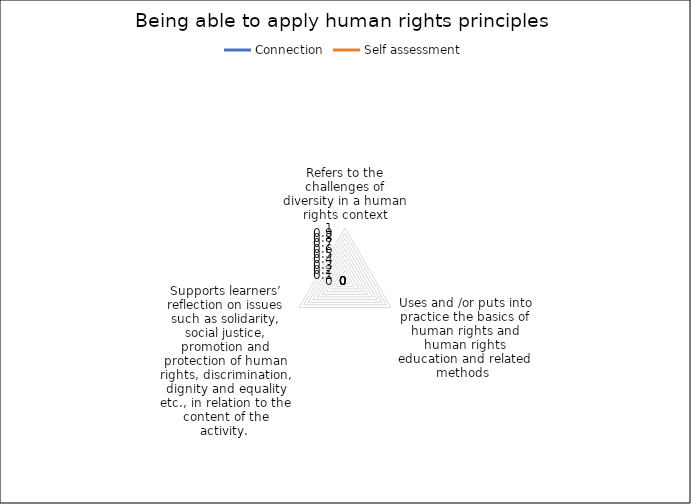
| Category | Connection | Self assessment |
|---|---|---|
| Refers to the challenges of diversity in a human rights context | 0 | 0 |
| Uses and /or puts into practice the basics of human rights and human rights education and related methods  | 0 | 0 |
| Supports learners’ reflection on issues such as solidarity, social justice, promotion and protection of human rights, discrimination, dignity and equality etc., in relation to the content of the activity.  | 0 | 0 |